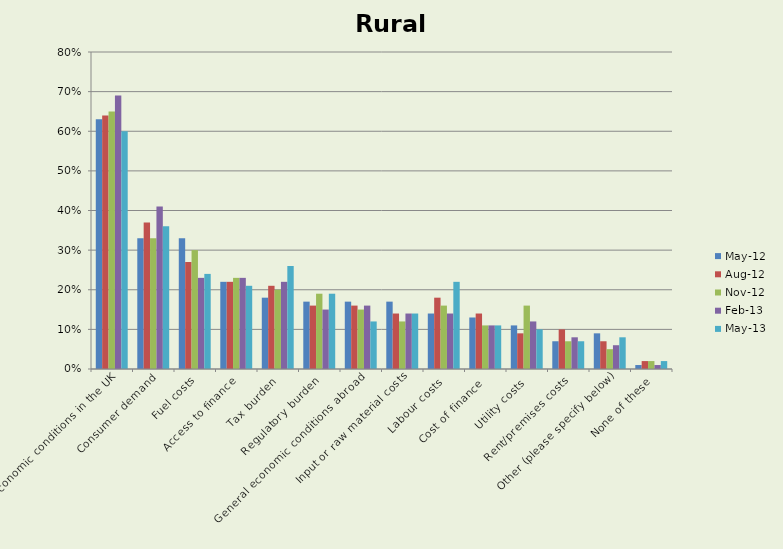
| Category | May-12 | Aug-12 | Nov-12 | Feb-13 | May-13 |
|---|---|---|---|---|---|
| General economic conditions in the UK  | 0.63 | 0.64 | 0.65 | 0.69 | 0.6 |
| Consumer demand | 0.33 | 0.37 | 0.33 | 0.41 | 0.36 |
| Fuel costs | 0.33 | 0.27 | 0.3 | 0.23 | 0.24 |
| Access to finance | 0.22 | 0.22 | 0.23 | 0.23 | 0.21 |
| Tax burden | 0.18 | 0.21 | 0.2 | 0.22 | 0.26 |
| Regulatory burden | 0.17 | 0.16 | 0.19 | 0.15 | 0.19 |
| General economic conditions abroad  | 0.17 | 0.16 | 0.15 | 0.16 | 0.12 |
| Input or raw material costs | 0.17 | 0.14 | 0.12 | 0.14 | 0.14 |
| Labour costs | 0.14 | 0.18 | 0.16 | 0.14 | 0.22 |
| Cost of finance  | 0.13 | 0.14 | 0.11 | 0.11 | 0.11 |
| Utility costs | 0.11 | 0.09 | 0.16 | 0.12 | 0.1 |
| Rent/premises costs | 0.07 | 0.1 | 0.07 | 0.08 | 0.07 |
| Other (please specify below) | 0.09 | 0.07 | 0.05 | 0.06 | 0.08 |
| None of these | 0.01 | 0.02 | 0.02 | 0.01 | 0.02 |